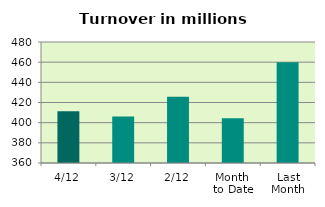
| Category | Series 0 |
|---|---|
| 4/12 | 411.241 |
| 3/12 | 406.118 |
| 2/12 | 425.678 |
| Month 
to Date | 404.332 |
| Last
Month | 459.961 |